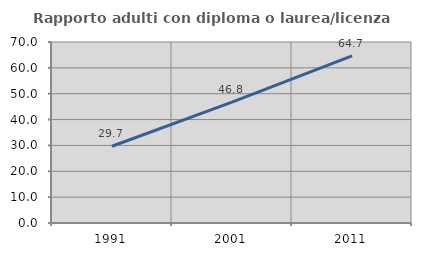
| Category | Rapporto adulti con diploma o laurea/licenza media  |
|---|---|
| 1991.0 | 29.688 |
| 2001.0 | 46.774 |
| 2011.0 | 64.664 |